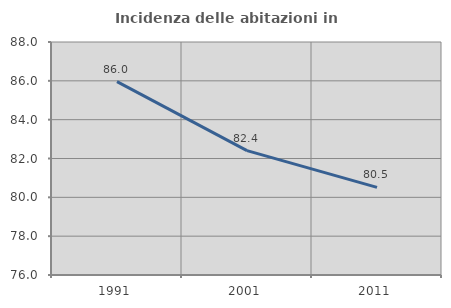
| Category | Incidenza delle abitazioni in proprietà  |
|---|---|
| 1991.0 | 85.962 |
| 2001.0 | 82.408 |
| 2011.0 | 80.512 |